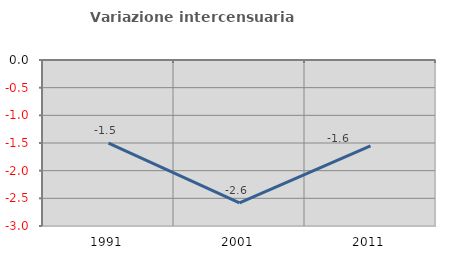
| Category | Variazione intercensuaria annua |
|---|---|
| 1991.0 | -1.502 |
| 2001.0 | -2.582 |
| 2011.0 | -1.551 |